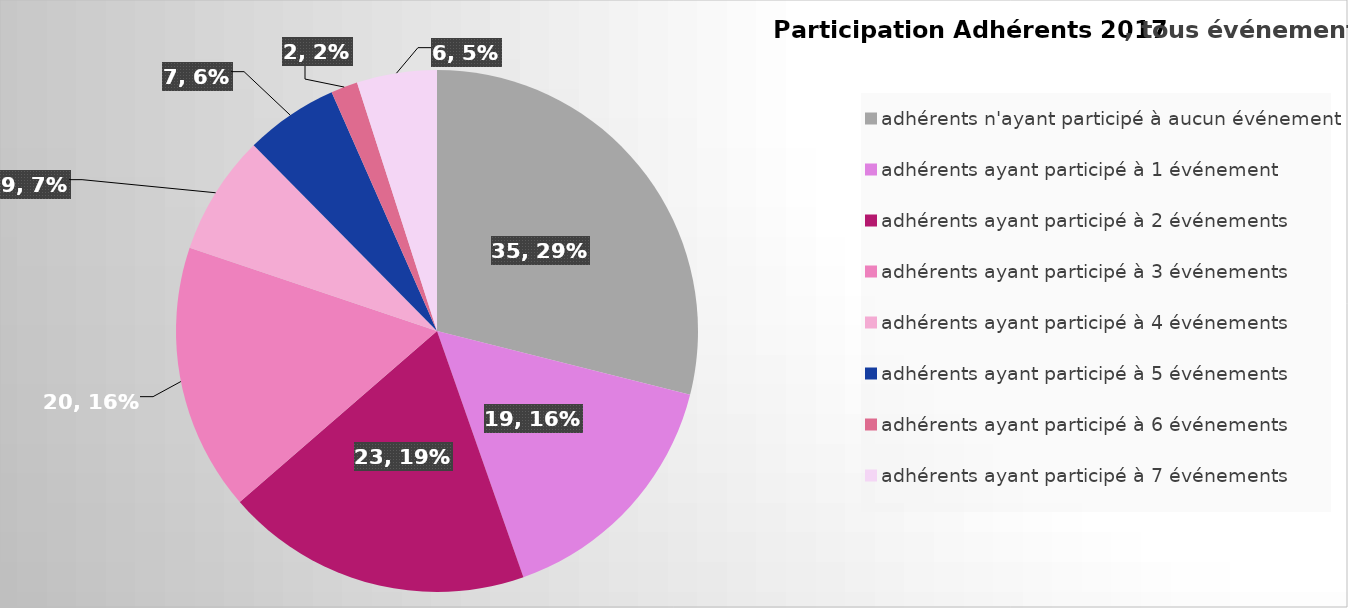
| Category | Series 0 |
|---|---|
| adhérents n'ayant participé à aucun événement | 35 |
| adhérents ayant participé à 1 événement | 19 |
| adhérents ayant participé à 2 événements | 23 |
| adhérents ayant participé à 3 événements | 20 |
| adhérents ayant participé à 4 événements | 9 |
| adhérents ayant participé à 5 événements | 7 |
| adhérents ayant participé à 6 événements | 2 |
| adhérents ayant participé à 7 événements | 6 |